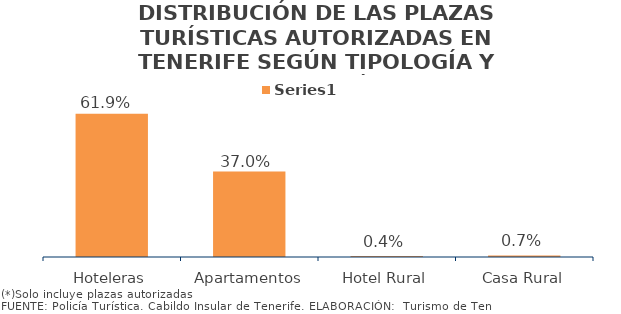
| Category | Series 0 |
|---|---|
| Hoteleras | 0.619 |
| Apartamentos | 0.37 |
| Hotel Rural | 0.004 |
| Casa Rural | 0.007 |